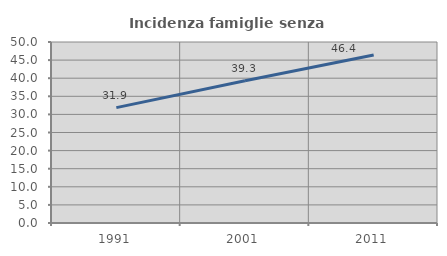
| Category | Incidenza famiglie senza nuclei |
|---|---|
| 1991.0 | 31.864 |
| 2001.0 | 39.286 |
| 2011.0 | 46.408 |